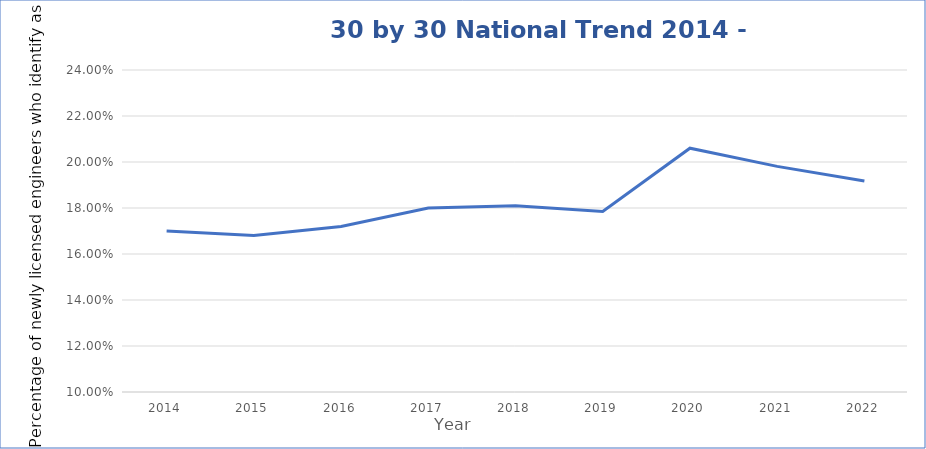
| Category |   National 30 by 30 Percentage   |
|---|---|
| 2014.0 | 0.17 |
| 2015.0 | 0.168 |
| 2016.0 | 0.172 |
| 2017.0 | 0.18 |
| 2018.0 | 0.181 |
| 2019.0 | 0.178 |
| 2020.0 | 0.206 |
| 2021.0 | 0.198 |
| 2022.0 | 0.192 |